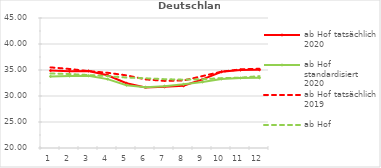
| Category | ab Hof tatsächlich 2020 | ab Hof standardisiert 2020 | ab Hof tatsächlich 2019 | ab Hof standardisiert 2019 |
|---|---|---|---|---|
| 0 | 34.881 | 33.767 | 35.503 | 34.324 |
| 1 | 34.745 | 33.844 | 35.198 | 34.223 |
| 2 | 34.821 | 33.893 | 34.795 | 34.029 |
| 3 | 33.98 | 33.25 | 34.47 | 33.826 |
| 4 | 32.444 | 32.08 | 33.966 | 33.549 |
| 5 | 31.65 | 31.663 | 33.196 | 33.408 |
| 6 | 31.77 | 31.893 | 32.906 | 33.235 |
| 7 | 31.96 | 32.246 | 32.98 | 33.138 |
| 8 | 33.193 | 32.695 | 33.831 | 33.229 |
| 9 | 34.654 | 33.281 | 34.675 | 33.434 |
| 10 | 34.983 | 33.468 | 35.125 | 33.528 |
| 11 | 35.038 | 33.5 | 35.238 | 33.821 |